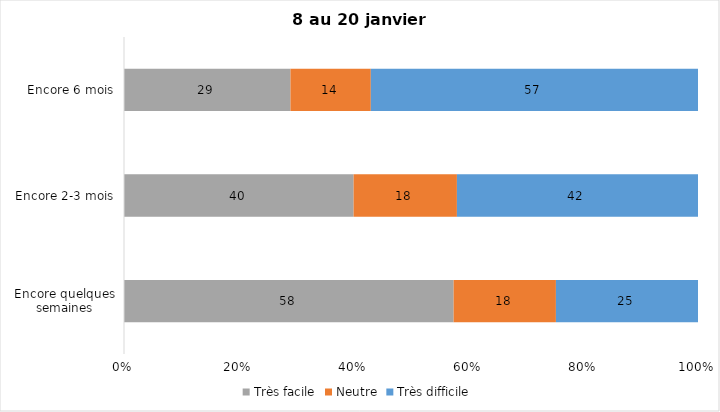
| Category | Très facile | Neutre | Très difficile |
|---|---|---|---|
| Encore quelques semaines | 58 | 18 | 25 |
| Encore 2-3 mois | 40 | 18 | 42 |
| Encore 6 mois | 29 | 14 | 57 |